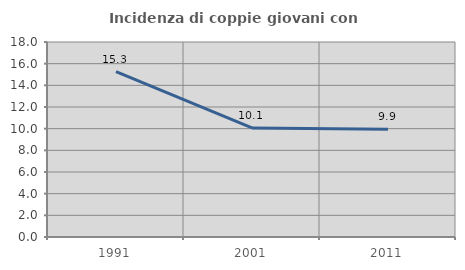
| Category | Incidenza di coppie giovani con figli |
|---|---|
| 1991.0 | 15.268 |
| 2001.0 | 10.069 |
| 2011.0 | 9.944 |